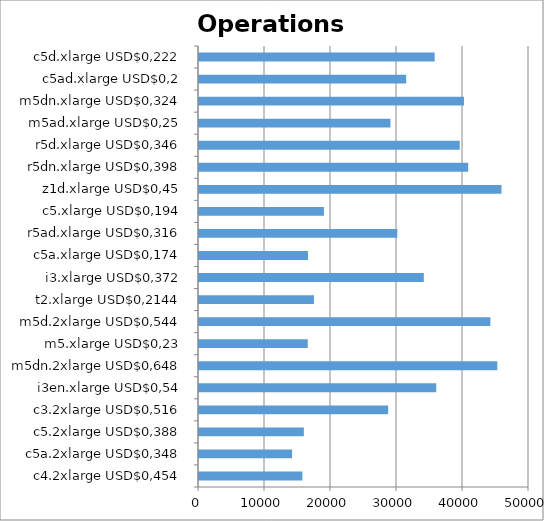
| Category | Operations (ins+upd+del) |
|---|---|
| c4.2xlarge USD$0,454 | 15667.757 |
| c5a.2xlarge USD$0,348 | 14101.379 |
| c5.2xlarge USD$0,388 | 15884.83 |
| c3.2xlarge USD$0,516 | 28660.307 |
| i3en.xlarge USD$0,54 | 35948.329 |
| m5dn.2xlarge USD$0,648 | 45197.9 |
| m5.xlarge USD$0,23 | 16477.509 |
| m5d.2xlarge USD$0,544 | 44150.335 |
| t2.xlarge USD$0,2144 | 17416.256 |
| i3.xlarge USD$0,372 | 34060.86 |
| c5a.xlarge USD$0,174 | 16517.356 |
| r5ad.xlarge USD$0,316 | 30045.076 |
| c5.xlarge USD$0,194 | 18935.637 |
| z1d.xlarge USD$0,45 | 45833.912 |
| r5dn.xlarge USD$0,398 | 40791.508 |
| r5d.xlarge USD$0,346 | 39505.207 |
| m5ad.xlarge USD$0,25 | 29007.302 |
| m5dn.xlarge USD$0,324 | 40143.349 |
| c5ad.xlarge USD$0,2 | 31390.278 |
| c5d.xlarge USD$0,222 | 35708.829 |